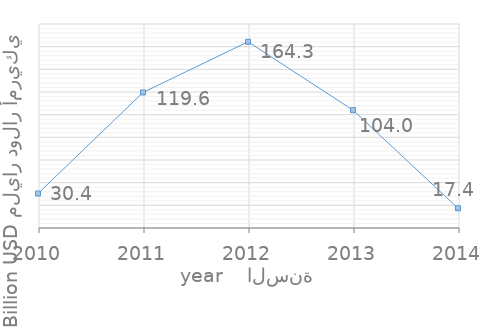
| Category | القيمة
Value |
|---|---|
| 2014.0 | 17.4 |
| 2013.0 | 104 |
| 2012.0 | 164.3 |
| 2011.0 | 119.6 |
| 2010.0 | 30.4 |